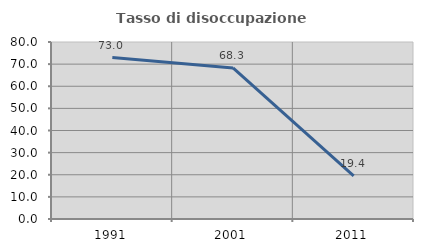
| Category | Tasso di disoccupazione giovanile  |
|---|---|
| 1991.0 | 72.989 |
| 2001.0 | 68.293 |
| 2011.0 | 19.444 |